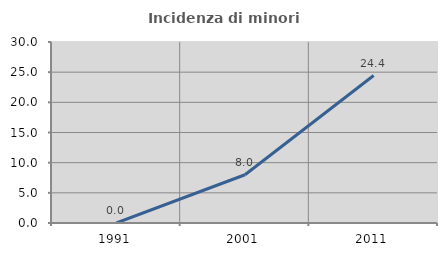
| Category | Incidenza di minori stranieri |
|---|---|
| 1991.0 | 0 |
| 2001.0 | 8 |
| 2011.0 | 24.444 |